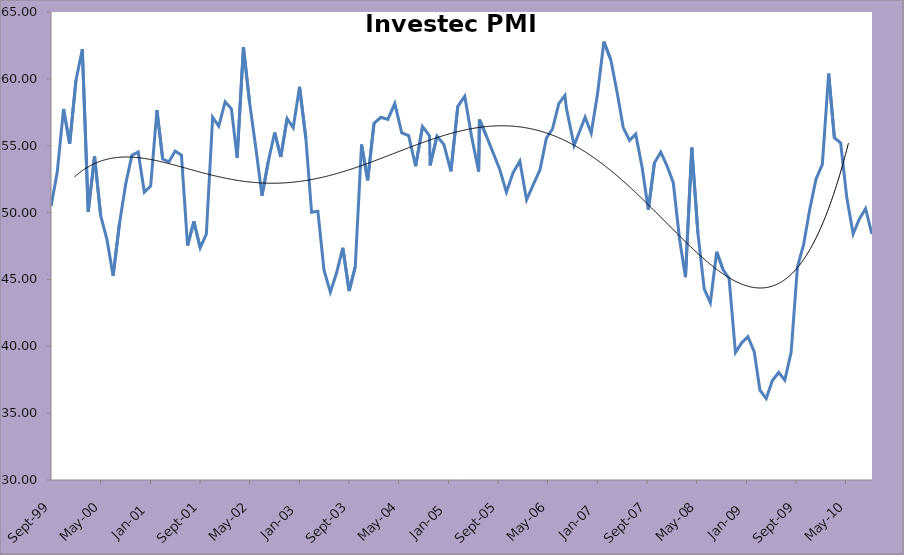
| Category | Investec PMI Survey |
|---|---|
| 1999-09-01 | 50.498 |
| 1999-10-01 | 53.005 |
| 1999-11-01 | 57.748 |
| 1999-12-01 | 55.143 |
| 2000-01-01 | 59.898 |
| 2000-02-01 | 62.218 |
| 2000-03-01 | 50.068 |
| 2000-04-01 | 54.199 |
| 2000-05-01 | 49.769 |
| 2000-06-01 | 47.974 |
| 2000-07-01 | 45.276 |
| 2000-08-01 | 49.16 |
| 2000-09-01 | 52.154 |
| 2000-10-01 | 54.282 |
| 2000-11-01 | 54.529 |
| 2000-12-01 | 51.528 |
| 2001-01-01 | 51.985 |
| 2001-02-01 | 57.658 |
| 2001-03-01 | 54.005 |
| 2001-04-01 | 53.794 |
| 2001-05-01 | 54.596 |
| 2001-06-01 | 54.29 |
| 2001-07-01 | 47.532 |
| 2001-08-01 | 49.332 |
| 2001-09-01 | 47.36 |
| 2001-10-01 | 48.38 |
| 2001-11-01 | 57.124 |
| 2001-12-01 | 56.455 |
| 2002-01-01 | 58.284 |
| 2002-02-01 | 57.762 |
| 2002-03-01 | 54.105 |
| 2002-04-01 | 62.375 |
| 2002-05-01 | 58.241 |
| 2002-06-01 | 54.788 |
| 2002-07-01 | 51.264 |
| 2002-08-01 | 53.84 |
| 2002-09-01 | 55.989 |
| 2002-10-01 | 54.161 |
| 2002-11-01 | 57.038 |
| 2002-12-01 | 56.344 |
| 2003-01-01 | 59.405 |
| 2003-02-01 | 55.554 |
| 2003-03-01 | 50.029 |
| 2003-04-01 | 50.096 |
| 2003-05-01 | 45.683 |
| 2003-06-01 | 44.053 |
| 2003-07-01 | 45.458 |
| 2003-08-01 | 47.365 |
| 2003-09-01 | 44.134 |
| 2003-10-01 | 45.941 |
| 2003-11-01 | 55.09 |
| 2003-12-01 | 52.412 |
| 2004-01-01 | 56.677 |
| 2004-02-04 | 57.128 |
| 2004-03-09 | 56.969 |
| 2004-04-12 | 58.155 |
| 2004-05-16 | 55.959 |
| 2004-06-19 | 55.751 |
| 2004-07-23 | 53.463 |
| 2004-08-26 | 56.431 |
| 2004-09-29 | 55.742 |
| 2004-10-02 | 53.528 |
| 2004-11-05 | 55.717 |
| 2004-12-09 | 55.08 |
| 2005-01-12 | 53.087 |
| 2005-02-15 | 57.945 |
| 2005-03-21 | 58.708 |
| 2005-04-24 | 55.642 |
| 2005-05-28 | 53.074 |
| 2005-06-01 | 56.957 |
| 2005-07-04 | 55.768 |
| 2005-08-06 | 54.504 |
| 2005-09-08 | 53.25 |
| 2005-10-11 | 51.524 |
| 2005-11-13 | 52.987 |
| 2005-12-16 | 53.847 |
| 2006-01-18 | 50.953 |
| 2006-02-20 | 52.093 |
| 2006-03-25 | 53.208 |
| 2006-04-25 | 55.563 |
| 2006-05-25 | 56.248 |
| 2006-06-25 | 58.142 |
| 2006-07-25 | 58.759 |
| 2006-08-01 | 57.824 |
| 2006-09-08 | 55.014 |
| 2006-10-01 | 55.916 |
| 2006-11-01 | 57.129 |
| 2006-12-01 | 55.944 |
| 2007-01-01 | 58.892 |
| 2007-02-01 | 62.783 |
| 2007-03-07 | 61.424 |
| 2007-04-07 | 58.977 |
| 2007-05-07 | 56.359 |
| 2007-06-07 | 55.4 |
| 2007-07-07 | 55.862 |
| 2007-08-07 | 53.433 |
| 2007-09-07 | 50.206 |
| 2007-10-07 | 53.734 |
| 2007-11-07 | 54.513 |
| 2007-12-07 | 53.516 |
| 2008-01-07 | 52.258 |
| 2008-02-07 | 48.028 |
| 2008-03-07 | 45.17 |
| 2008-04-07 | 54.86 |
| 2008-05-07 | 48.457 |
| 2008-06-07 | 44.285 |
| 2008-07-07 | 43.259 |
| 2008-08-07 | 47.067 |
| 2008-09-07 | 45.741 |
| 2008-10-07 | 45.069 |
| 2008-11-07 | 39.534 |
| 2008-12-07 | 40.241 |
| 2009-01-07 | 40.72 |
| 2009-02-07 | 39.603 |
| 2009-03-07 | 36.727 |
| 2009-04-07 | 36.089 |
| 2009-05-07 | 37.438 |
| 2009-06-07 | 38.043 |
| 2009-07-07 | 37.469 |
| 2009-08-07 | 39.548 |
| 2009-09-07 | 45.938 |
| 2009-10-07 | 47.6 |
| 2009-11-07 | 50.3 |
| 2009-12-07 | 52.5 |
| 2010-01-07 | 53.6 |
| 2010-02-07 | 60.4 |
| 2010-03-07 | 55.6 |
| 2010-04-07 | 55.2 |
| 2010-05-07 | 51.1 |
| 2010-06-07 | 48.4 |
| 2010-07-07 | 49.5 |
| 2010-08-07 | 50.3 |
| 2010-09-07 | 48.4 |